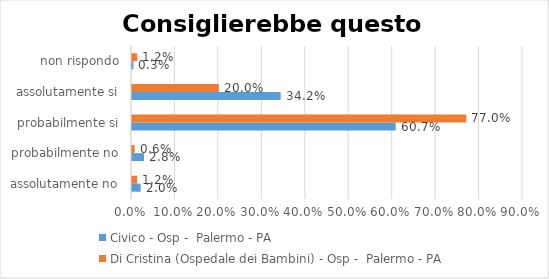
| Category | Civico - Osp -  Palermo - PA | Di Cristina (Ospedale dei Bambini) - Osp -  Palermo - PA |
|---|---|---|
| assolutamente no | 0.02 | 0.012 |
| probabilmente no | 0.028 | 0.006 |
| probabilmente si | 0.607 | 0.77 |
| assolutamente si | 0.342 | 0.2 |
| non rispondo | 0.003 | 0.012 |